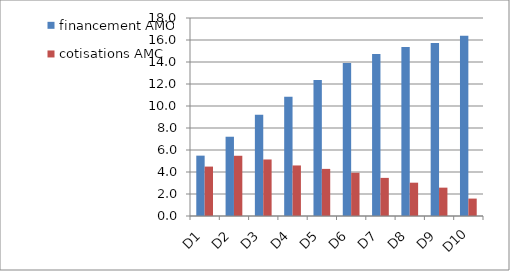
| Category | financement AMO | cotisations AMC |
|---|---|---|
| D1 | 5.487 | 4.492 |
| D2 | 7.206 | 5.476 |
| D3 | 9.203 | 5.138 |
| D4 | 10.851 | 4.595 |
| D5 | 12.37 | 4.283 |
| D6 | 13.918 | 3.932 |
| D7 | 14.727 | 3.465 |
| D8 | 15.355 | 3.028 |
| D9 | 15.738 | 2.577 |
| D10 | 16.384 | 1.583 |